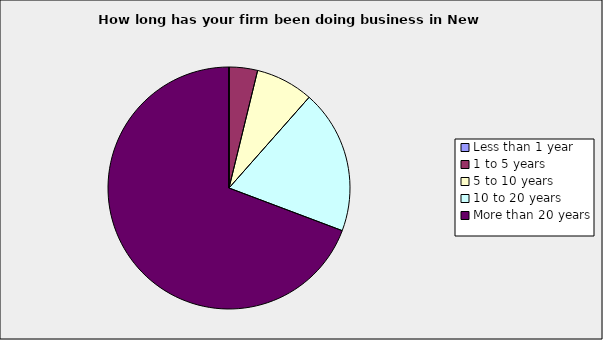
| Category | Series 0 |
|---|---|
| Less than 1 year | 0 |
| 1 to 5 years | 0.038 |
| 5 to 10 years | 0.077 |
| 10 to 20 years | 0.192 |
| More than 20 years | 0.692 |